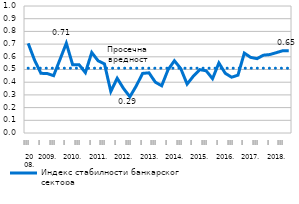
| Category | Индекс стабилности банкарског сектора | Просечна вредност |
|---|---|---|
| 0 | 0.706 | 0.51 |
| 1 | 0.574 | 0.51 |
| 2 | 0.47 | 0.51 |
| 3 | 0.468 | 0.51 |
| 4 | 0.451 | 0.51 |
| 5 | 0.578 | 0.51 |
| 6 | 0.707 | 0.51 |
| 7 | 0.537 | 0.51 |
| 8 | 0.538 | 0.51 |
| 9 | 0.475 | 0.51 |
| 10 | 0.634 | 0.51 |
| 11 | 0.568 | 0.51 |
| 12 | 0.544 | 0.51 |
| 13 | 0.327 | 0.51 |
| 14 | 0.431 | 0.51 |
| 15 | 0.35 | 0.51 |
| 16 | 0.285 | 0.51 |
| 17 | 0.371 | 0.51 |
| 18 | 0.469 | 0.51 |
| 19 | 0.474 | 0.51 |
| 20 | 0.4 | 0.51 |
| 21 | 0.372 | 0.51 |
| 22 | 0.498 | 0.51 |
| 23 | 0.569 | 0.51 |
| 24 | 0.507 | 0.51 |
| 25 | 0.385 | 0.51 |
| 26 | 0.449 | 0.51 |
| 27 | 0.499 | 0.51 |
| 28 | 0.49 | 0.51 |
| 29 | 0.428 | 0.51 |
| 30 | 0.552 | 0.51 |
| 31 | 0.47 | 0.51 |
| 32 | 0.439 | 0.51 |
| 33 | 0.455 | 0.51 |
| 34 | 0.629 | 0.51 |
| 35 | 0.595 | 0.51 |
| 36 | 0.585 | 0.51 |
| 37 | 0.613 | 0.51 |
| 38 | 0.618 | 0.51 |
| 39 | 0.632 | 0.51 |
| 40 | 0.647 | 0.51 |
| 41 | 0.647 | 0.51 |